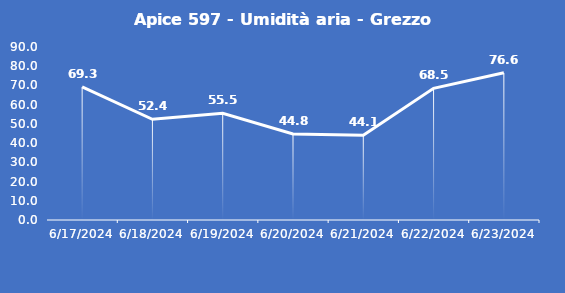
| Category | Apice 597 - Umidità aria - Grezzo (%) |
|---|---|
| 6/17/24 | 69.3 |
| 6/18/24 | 52.4 |
| 6/19/24 | 55.5 |
| 6/20/24 | 44.8 |
| 6/21/24 | 44.1 |
| 6/22/24 | 68.5 |
| 6/23/24 | 76.6 |